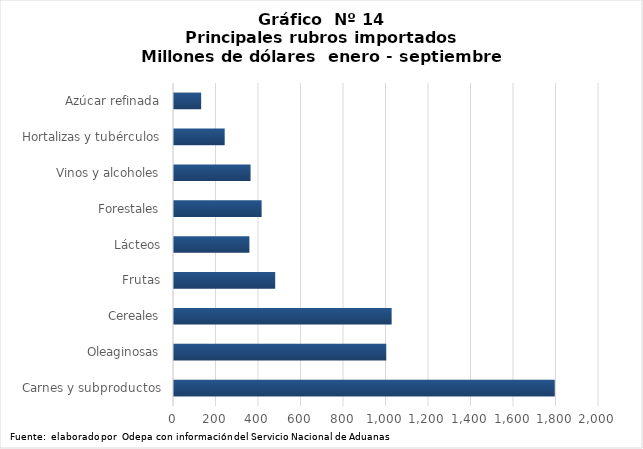
| Category | Series 0 |
|---|---|
| Carnes y subproductos | 1791883.406 |
| Oleaginosas | 998868.604 |
| Cereales | 1024168.105 |
| Frutas | 476228.675 |
| Lácteos | 354863.938 |
| Forestales | 412350 |
| Vinos y alcoholes | 360288.761 |
| Hortalizas y tubérculos | 238542.164 |
| Azúcar refinada | 127762.063 |